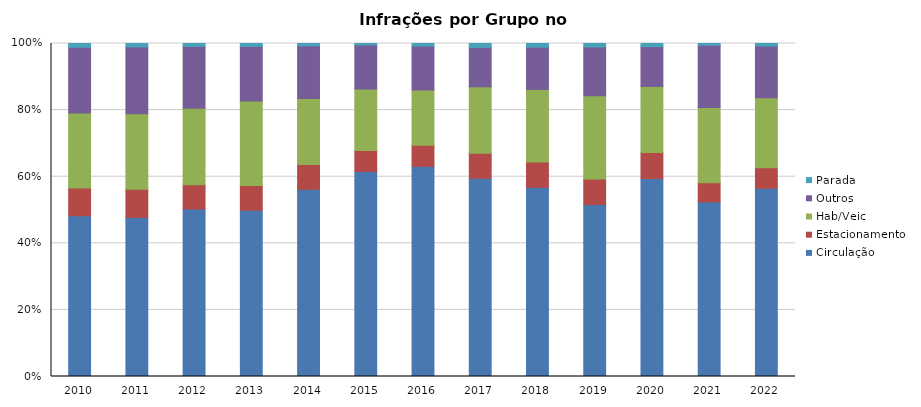
| Category | Circulação | Estacionamento | Hab/Veic | Outros | Parada |
|---|---|---|---|---|---|
| 2010 | 945509 | 163958 | 440953 | 386547 | 22129 |
| 2011 | 1037513 | 184327 | 492659 | 435239 | 22280 |
| 2012 | 1216024 | 175481 | 556126 | 448512 | 20692 |
| 2013 | 1171821 | 174154 | 596867 | 384572 | 20172 |
| 2014 | 1646080 | 219143 | 579245 | 463336 | 20511 |
| 2015 | 2099250 | 214238 | 628782 | 452293 | 14788 |
| 2016 | 2292042 | 229240 | 604891 | 477190 | 28962 |
| 2017 | 1950969 | 247677 | 653266 | 387529 | 38831 |
| 2018 | 1789627 | 239935 | 686740 | 399526 | 34646 |
| 2019 | 1365993 | 201952 | 661921 | 387009 | 27775 |
| 2020 | 1295581 | 169973 | 432537 | 260413 | 20522 |
| 2021 | 1660861 | 183225 | 714452 | 592789 | 16158 |
| 2022 | 1856204 | 201906 | 690567 | 510543 | 24519 |